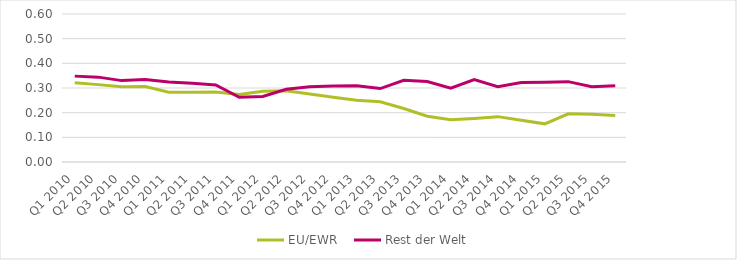
| Category | EU/EWR | Rest der Welt |
|---|---|---|
| Q1 2010 | 0.321 | 0.348 |
| Q2 2010 | 0.314 | 0.344 |
| Q3 2010 | 0.305 | 0.33 |
| Q4 2010 | 0.306 | 0.334 |
| Q1 2011 | 0.283 | 0.324 |
| Q2 2011 | 0.282 | 0.319 |
| Q3 2011 | 0.283 | 0.312 |
| Q4 2011 | 0.274 | 0.262 |
| Q1 2012 | 0.286 | 0.266 |
| Q2 2012 | 0.289 | 0.295 |
| Q3 2012 | 0.276 | 0.305 |
| Q4 2012 | 0.262 | 0.308 |
| Q1 2013 | 0.25 | 0.309 |
| Q2 2013 | 0.244 | 0.298 |
| Q3 2013 | 0.217 | 0.331 |
| Q4 2013 | 0.185 | 0.326 |
| Q1 2014 | 0.172 | 0.3 |
| Q2 2014 | 0.177 | 0.334 |
| Q3 2014 | 0.184 | 0.305 |
| Q4 2014 | 0.169 | 0.322 |
| Q1 2015 | 0.155 | 0.323 |
| Q2 2015 | 0.195 | 0.326 |
| Q3 2015 | 0.193 | 0.305 |
| Q4 2015 | 0.188 | 0.309 |